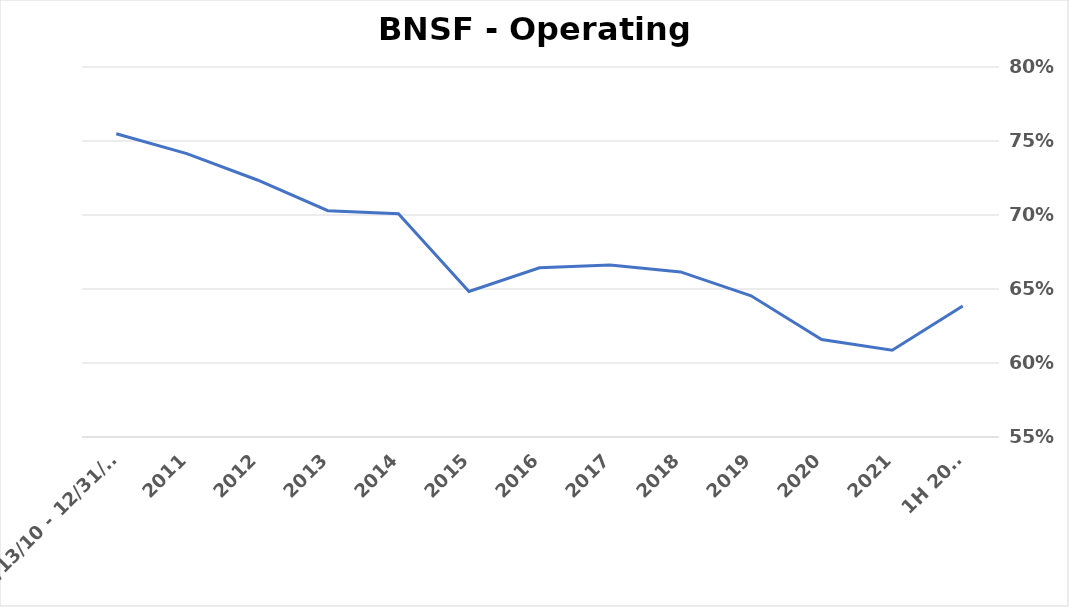
| Category | Operating ratio |
|---|---|
| 1H 2022 | 0.639 |
| 2021 | 0.609 |
| 2020 | 0.616 |
| 2019 | 0.645 |
| 2018 | 0.662 |
| 2017 | 0.666 |
| 2016 | 0.664 |
| 2015 | 0.648 |
| 2014 | 0.701 |
| 2013 | 0.703 |
| 2012 | 0.724 |
| 2011 | 0.741 |
| 2/13/10 - 12/31/10 | 0.755 |